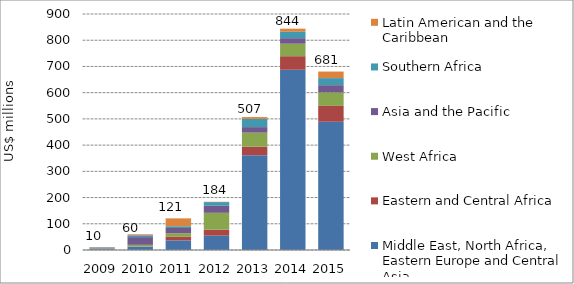
| Category | Middle East, North Africa, Eastern Europe and Central Asia | Eastern and Central Africa | West Africa | Asia and the Pacific | Southern Africa | Latin American and the Caribbean |
|---|---|---|---|---|---|---|
| 2009.0 | 2.889 | 0 | 3.593 | 3.088 | 0.766 | 0 |
| 2010.0 | 12.952 | 0.065 | 6.647 | 29.473 | 7.023 | 3.704 |
| 2011.0 | 36.518 | 13.808 | 13.814 | 19.703 | 6.671 | 30.103 |
| 2012.0 | 54.626 | 22.682 | 64.488 | 26.817 | 14.094 | 1.242 |
| 2013.0 | 361.581 | 32.127 | 53.783 | 21.18 | 31.401 | 6.89 |
| 2014.0 | 687.371 | 51.718 | 47.599 | 21.156 | 24.31 | 11.856 |
| 2015.0 | 489.032 | 60.567 | 51.388 | 27.569 | 26.966 | 24.999 |